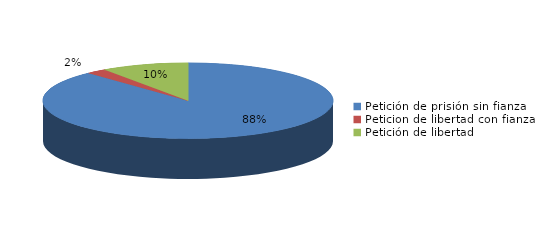
| Category | Series 0 |
|---|---|
| Petición de prisión sin fianza | 784 |
| Peticion de libertad con fianza | 20 |
| Petición de libertad | 87 |